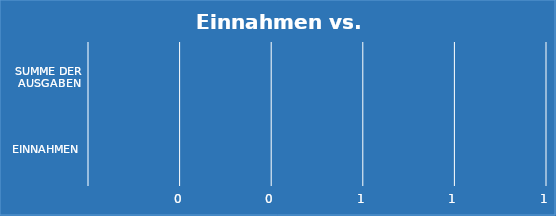
| Category | Series 0 |
|---|---|
| Einnahmen | 0 |
| Summe der Ausgaben | 0 |